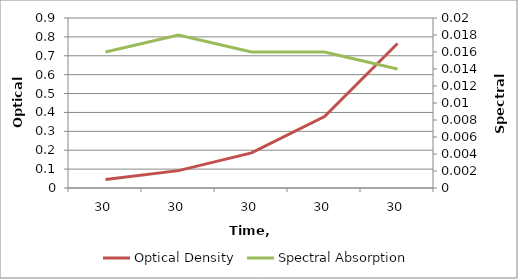
| Category | Optical Density |
|---|---|
| 30.0 | 0.045 |
| 30.0 | 0.092 |
| 30.0 | 0.186 |
| 30.0 | 0.378 |
| 30.0 | 0.765 |